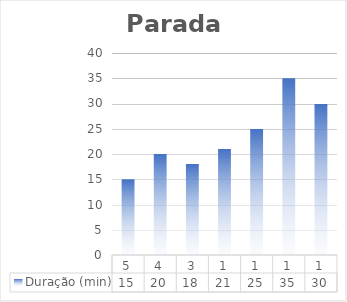
| Category | Duração (min) |
|---|---|
| 5.0 | 15 |
| 4.0 | 20 |
| 3.0 | 18 |
| 1.0 | 21 |
| 1.0 | 25 |
| 1.0 | 35 |
| 1.0 | 30 |